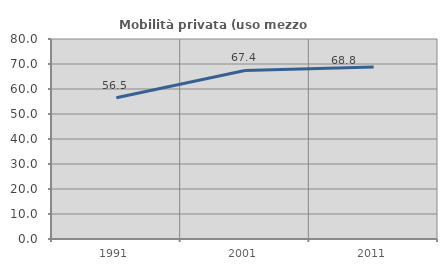
| Category | Mobilità privata (uso mezzo privato) |
|---|---|
| 1991.0 | 56.481 |
| 2001.0 | 67.403 |
| 2011.0 | 68.759 |